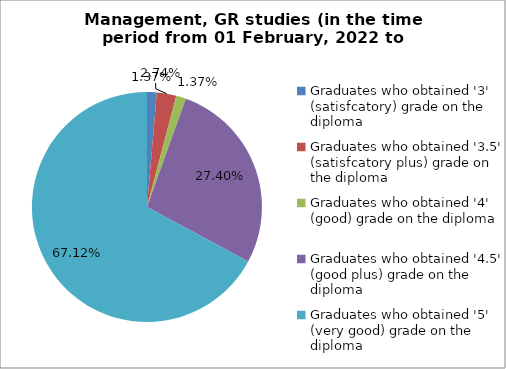
| Category | Series 0 |
|---|---|
| Graduates who obtained '3' (satisfcatory) grade on the diploma  | 1.37 |
| Graduates who obtained '3.5' (satisfcatory plus) grade on the diploma  | 2.74 |
| Graduates who obtained '4' (good) grade on the diploma  | 1.37 |
| Graduates who obtained '4.5' (good plus) grade on the diploma  | 27.397 |
| Graduates who obtained '5' (very good) grade on the diploma  | 67.123 |